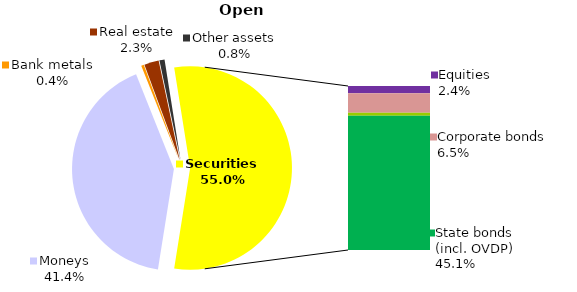
| Category | Open |
|---|---|
| Moneys | 489.088 |
| Bank metals | 4.975 |
| Real estate | 27.287 |
| Other assets | 9.635 |
| Equities | 28.556 |
| Corporate bonds | 77.302 |
| Municipal bonds | 11.573 |
| State bonds (incl. OVDP) | 531.99 |